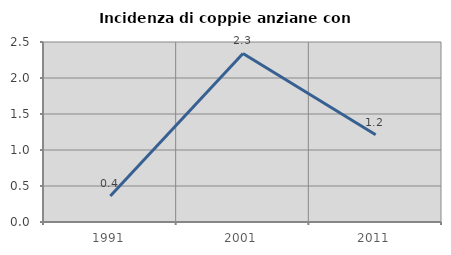
| Category | Incidenza di coppie anziane con figli |
|---|---|
| 1991.0 | 0.362 |
| 2001.0 | 2.341 |
| 2011.0 | 1.212 |